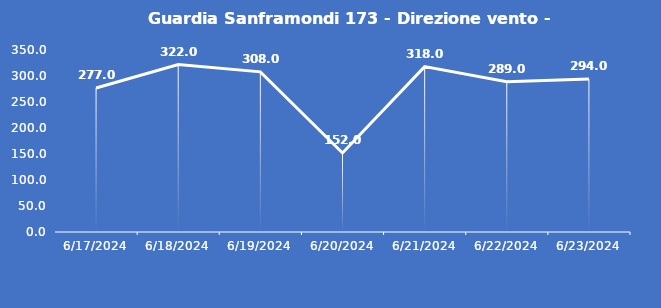
| Category | Guardia Sanframondi 173 - Direzione vento - Grezzo (°N) |
|---|---|
| 6/17/24 | 277 |
| 6/18/24 | 322 |
| 6/19/24 | 308 |
| 6/20/24 | 152 |
| 6/21/24 | 318 |
| 6/22/24 | 289 |
| 6/23/24 | 294 |